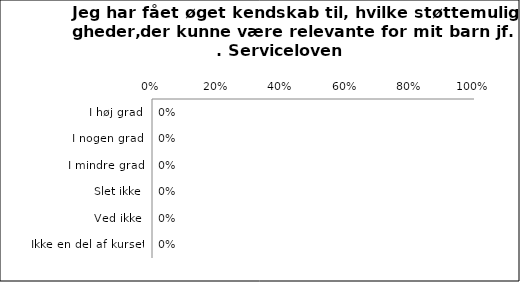
| Category | Øget kendskab til støttemuligheder, der kunne være relevante for mit barn |
|---|---|
| I høj grad | 0 |
| I nogen grad | 0 |
| I mindre grad | 0 |
| Slet ikke | 0 |
| Ved ikke | 0 |
| Ikke en del af kurset | 0 |